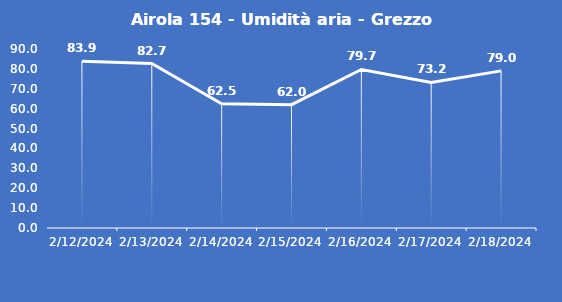
| Category | Airola 154 - Umidità aria - Grezzo (%) |
|---|---|
| 2/12/24 | 83.9 |
| 2/13/24 | 82.7 |
| 2/14/24 | 62.5 |
| 2/15/24 | 62 |
| 2/16/24 | 79.7 |
| 2/17/24 | 73.2 |
| 2/18/24 | 79 |